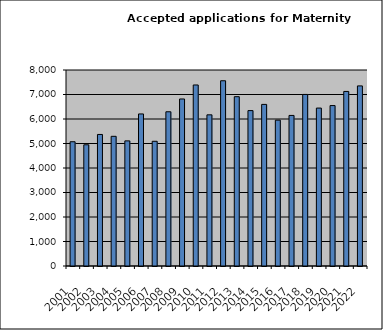
| Category | Series 1 |
|---|---|
| 2001.0 | 5072 |
| 2002.0 | 4948 |
| 2003.0 | 5369 |
| 2004.0 | 5293 |
| 2005.0 | 5107 |
| 2006.0 | 6206 |
| 2007.0 | 5090 |
| 2008.0 | 6295 |
| 2009.0 | 6817 |
| 2010.0 | 7389 |
| 2011.0 | 6170 |
| 2012.0 | 7561 |
| 2013.0 | 6911 |
| 2014.0 | 6343 |
| 2015.0 | 6596 |
| 2016.0 | 5953 |
| 2017.0 | 6146 |
| 2018.0 | 7003 |
| 2019.0 | 6446 |
| 2020.0 | 6548 |
| 2021.0 | 7125 |
| 2022.0 | 7351 |